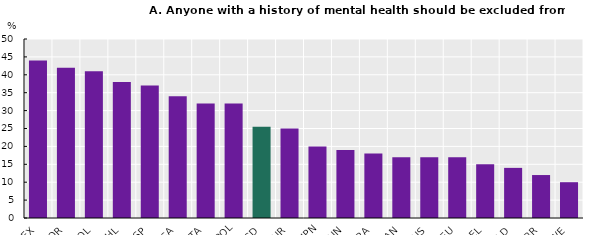
| Category | Anyone with a history of mental illness should be excluded from public office |
|---|---|
| MEX | 44 |
| KOR | 42 |
| COL | 41 |
| CHL | 38 |
| ESP | 37 |
| USA | 34 |
| ITA | 32 |
| POL | 32 |
| OECD | 25.474 |
| TUR | 25 |
| JPN | 20 |
| HUN | 19 |
| FRA | 18 |
| CAN | 17 |
| AUS | 17 |
| DEU | 17 |
| BEL | 15 |
| NLD | 14 |
| GBR | 12 |
| SWE | 10 |